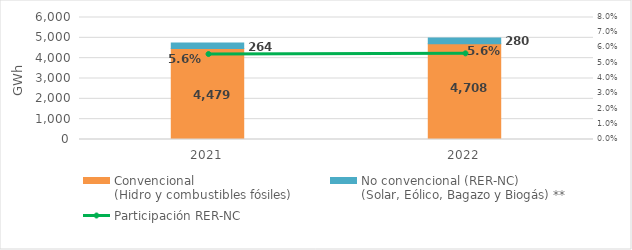
| Category | Convencional
(Hidro y combustibles fósiles) | No convencional (RER-NC)
(Solar, Eólico, Bagazo y Biogás) ** |
|---|---|---|
| 2021.0 | 4479.322 | 264.292 |
| 2022.0 | 4707.789 | 280.154 |